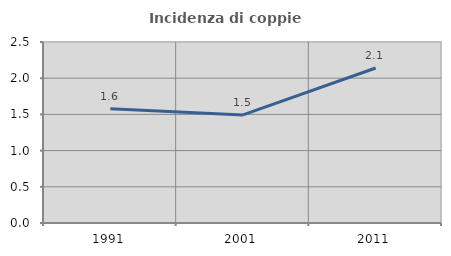
| Category | Incidenza di coppie miste |
|---|---|
| 1991.0 | 1.577 |
| 2001.0 | 1.493 |
| 2011.0 | 2.141 |